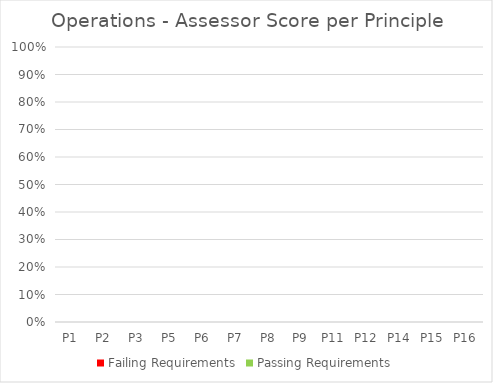
| Category | Failing Requirements | Passing Requirements |
|---|---|---|
| P1 | 0 | 0 |
| P2 | 0 | 0 |
| P3 | 0 | 0 |
| P5 | 0 | 0 |
| P6 | 0 | 0 |
| P7 | 0 | 0 |
| P8 | 0 | 0 |
| P9 | 0 | 0 |
| P11 | 0 | 0 |
| P12 | 0 | 0 |
| P14 | 0 | 0 |
| P15 | 0 | 0 |
| P16 | 0 | 0 |